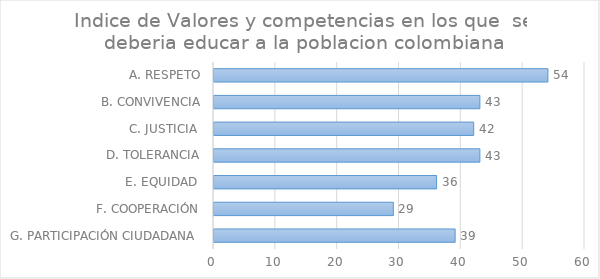
| Category | Series 0 |
|---|---|
| G. PARTICIPACIÓN CIUDADANA  | 39 |
| F. COOPERACIÓN | 29 |
| E. EQUIDAD  | 36 |
| D. TOLERANCIA | 43 |
| C. JUSTICIA  | 42 |
| B. CONVIVENCIA | 43 |
| A. RESPETO | 54 |